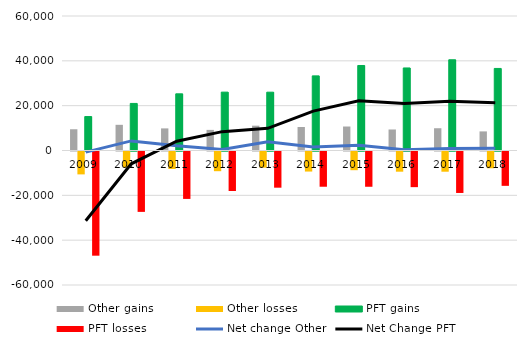
| Category | Other gains | Other losses | PFT gains | PFT losses |
|---|---|---|---|---|
| 2009.0 | 9475 | -10211 | 15142 | -46479 |
| 2010.0 | 11459 | -7184 | 20995 | -26937 |
| 2011.0 | 9865 | -7786 | 25286 | -21154 |
| 2012.0 | 9194 | -8786 | 26035 | -17625 |
| 2013.0 | 11070 | -7194 | 26016 | -16143 |
| 2014.0 | 10497 | -8946 | 33287 | -15719 |
| 2015.0 | 10702 | -8342 | 37922 | -15730 |
| 2016.0 | 9373 | -9008 | 36818 | -15900 |
| 2017.0 | 9931 | -9018 | 40475 | -18497 |
| 2018.0 | 8522 | -7473 | 36601 | -15322 |